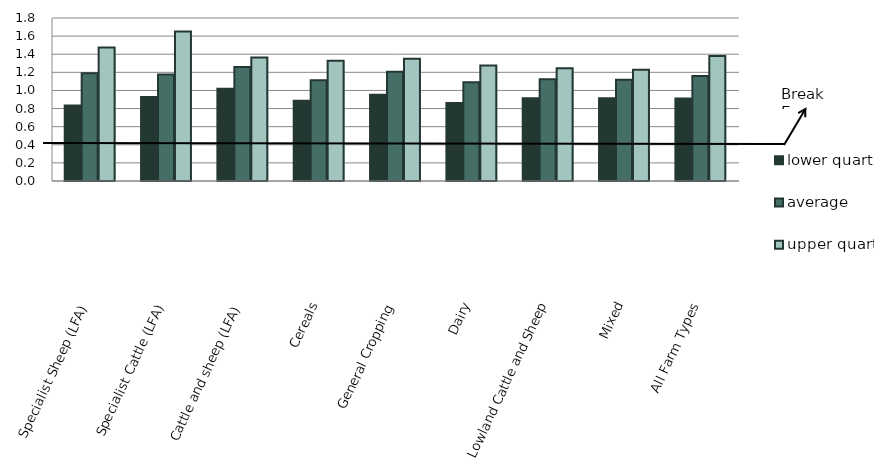
| Category | lower quartile | average | upper quartile |
|---|---|---|---|
| Specialist Sheep (LFA) | 0.835 | 1.191 | 1.473 |
| Specialist Cattle (LFA) | 0.928 | 1.177 | 1.65 |
| Cattle and sheep (LFA) | 1.018 | 1.258 | 1.364 |
| Cereals | 0.886 | 1.112 | 1.329 |
| General Cropping | 0.951 | 1.206 | 1.351 |
| Dairy | 0.86 | 1.09 | 1.274 |
| Lowland Cattle and Sheep | 0.913 | 1.123 | 1.244 |
| Mixed | 0.914 | 1.119 | 1.228 |
| All Farm Types | 0.912 | 1.159 | 1.381 |